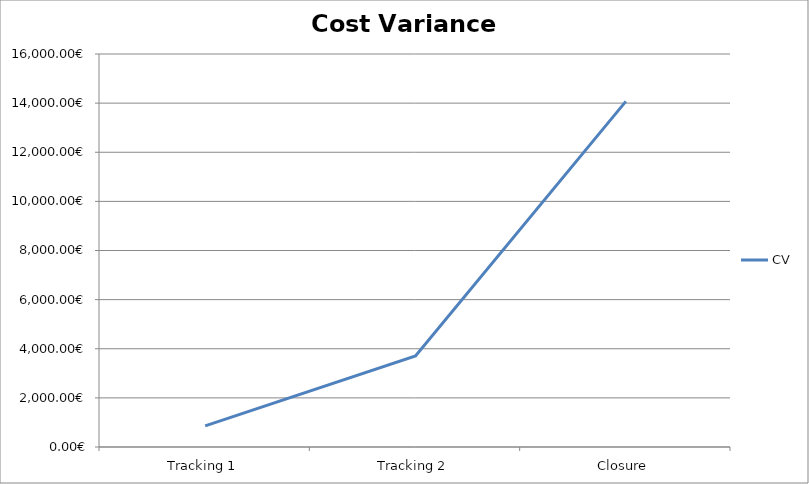
| Category | CV |
|---|---|
| Tracking 1 | 861.15 |
| Tracking 2 | 3704.4 |
| Closure | 14070 |